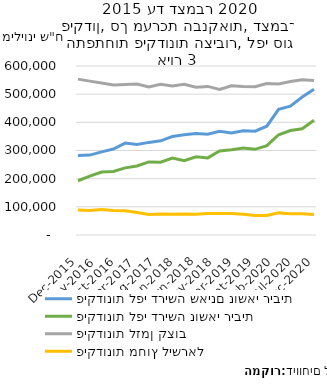
| Category | פיקדונות לפי דרישה שאינם נושאי ריבית | פיקדונות לפי דרישה נושאי ריבית | פיקדונות לזמן קצוב | פיקדונות מחוץ לישראל |
|---|---|---|---|---|
| 2015-12-31 | 282634.2 | 192649.9 | 553398.9 | 88739 |
| 2016-03-31 | 283671.4 | 208829.3 | 546372.9 | 87139 |
| 2016-06-30 | 295048.1 | 223670.8 | 539521.2 | 90595 |
| 2016-09-30 | 305223.2 | 225440.6 | 532439.4 | 86675 |
| 2016-12-31 | 326399.8 | 238419.1 | 534428.4 | 86120 |
| 2017-03-31 | 321172.1 | 245028.9 | 535753.9 | 80199 |
| 2017-06-30 | 328762.2 | 259452.1 | 525999 | 72718 |
| 2017-09-30 | 334315.9 | 258635.3 | 535416.2 | 74884 |
| 2017-12-31 | 349739.8 | 272900.8 | 528846.5 | 73901 |
| 2018-03-31 | 356249.9 | 263557.7 | 535088.3 | 74876 |
| 2018-06-30 | 360021.3 | 277919.8 | 524464.5 | 73384 |
| 2018-09-30 | 357641.7 | 273780.2 | 527599.7 | 76443 |
| 2018-12-31 | 367950.2 | 298081.6 | 516811.5 | 76725 |
| 2019-03-31 | 362328.6 | 302727 | 529803.2 | 76617 |
| 2019-06-30 | 370011.5 | 308420.3 | 527622.6 | 73435 |
| 2019-09-30 | 368682.6 | 304107.1 | 526721.6 | 69365 |
| 2019-12-31 | 386386 | 317103.1 | 537566.5 | 69275 |
| 2020-03-31 | 446024.2 | 355885 | 536116.2 | 78535 |
| 2020-06-30 | 457120.5 | 370765.9 | 544929.2 | 75535 |
| 2020-09-30 | 489641.4 | 377298.2 | 550760.4 | 75384 |
| 2020-12-31 | 517391.7 | 407211.4 | 548559.1 | 72810 |